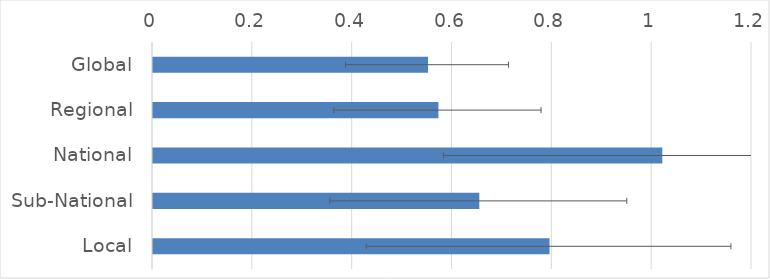
| Category | Series 0 |
|---|---|
| Global | 0.551 |
| Regional | 0.572 |
| National | 1.02 |
| Sub-National | 0.654 |
| Local | 0.794 |